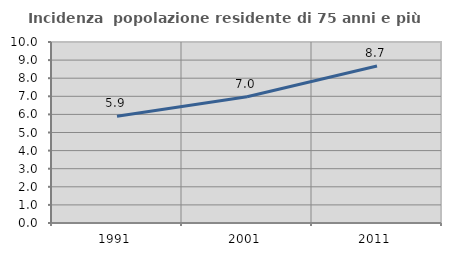
| Category | Incidenza  popolazione residente di 75 anni e più |
|---|---|
| 1991.0 | 5.901 |
| 2001.0 | 6.977 |
| 2011.0 | 8.673 |